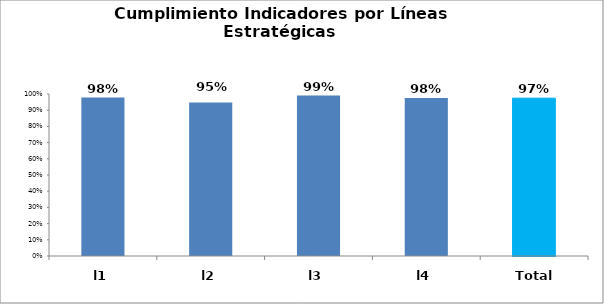
| Category | CUMPLIMIENTO |
|---|---|
| l1 | 0.978 |
| l2 | 0.948 |
| l3 | 0.99 |
| l4 | 0.976 |
| Total | 0.974 |